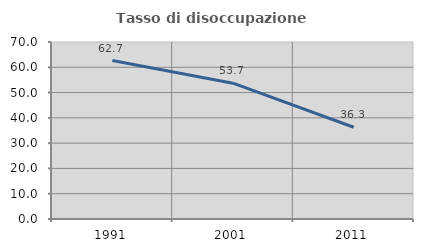
| Category | Tasso di disoccupazione giovanile  |
|---|---|
| 1991.0 | 62.667 |
| 2001.0 | 53.706 |
| 2011.0 | 36.284 |